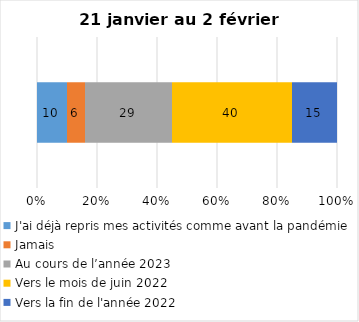
| Category | J'ai déjà repris mes activités comme avant la pandémie | Jamais | Au cours de l’année 2023 | Vers le mois de juin 2022 | Vers la fin de l'année 2022 |
|---|---|---|---|---|---|
| 0 | 10 | 6 | 29 | 40 | 15 |